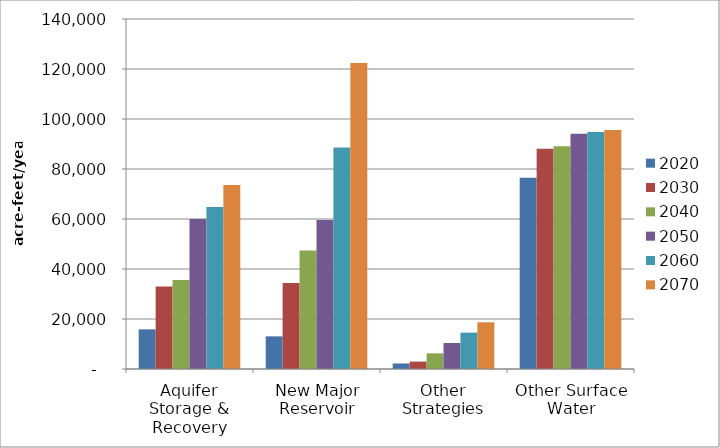
| Category | 2020 | 2030 | 2040 | 2050 | 2060 | 2070 |
|---|---|---|---|---|---|---|
| Aquifer Storage & Recovery | 15855 | 33019 | 35633 | 59974 | 64834 | 73553 |
| New Major Reservoir | 13053 | 34421 | 47356 | 59636 | 88610 | 122418 |
| Other Strategies | 2208 | 2953 | 6266 | 10407 | 14548 | 18689 |
| Other Surface Water | 76453 | 88103 | 89128 | 94116 | 94760 | 95592 |